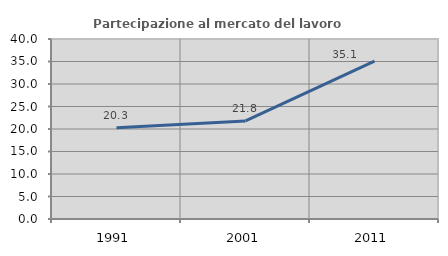
| Category | Partecipazione al mercato del lavoro  femminile |
|---|---|
| 1991.0 | 20.259 |
| 2001.0 | 21.782 |
| 2011.0 | 35.096 |